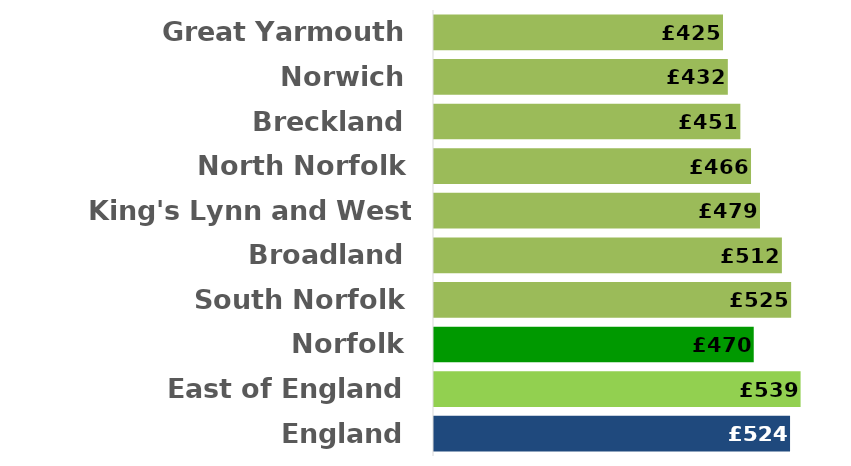
| Category | Series 0 |
|---|---|
| England | 523.6 |
| East of England | 539.1 |
| Norfolk | 470.2 |
| South Norfolk | 525.2 |
| Broadland | 511.6 |
| King's Lynn and West Norfolk | 479.4 |
| North Norfolk | 466.2 |
| Breckland | 450.5 |
| Norwich | 432.1 |
| Great Yarmouth | 425 |